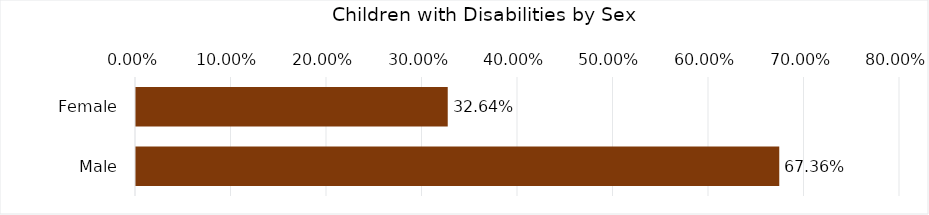
| Category | Percentage |
|---|---|
| Female | 0.326 |
| Male | 0.674 |